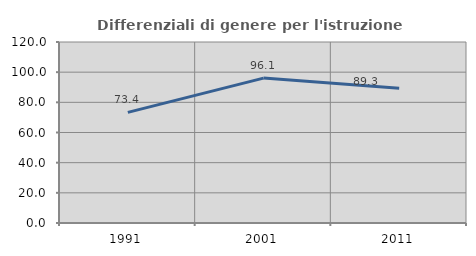
| Category | Differenziali di genere per l'istruzione superiore |
|---|---|
| 1991.0 | 73.364 |
| 2001.0 | 96.079 |
| 2011.0 | 89.29 |